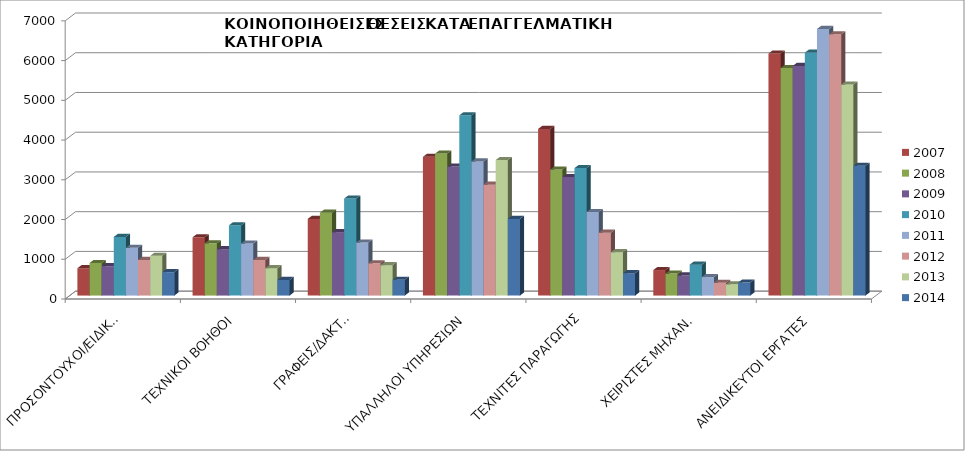
| Category | 2007 | 2008 | 2009 | 2010 | 2011 | 2012 | 2013 | 2014 |
|---|---|---|---|---|---|---|---|---|
| ΠΡΟΣΟΝΤΟΥΧΟΙ/ΕΙΔΙΚΟΙ | 688 | 819 | 741 | 1476 | 1201 | 896 | 999 | 590 |
| ΤΕΧΝΙΚΟΙ ΒΟΗΘΟΙ | 1467 | 1315 | 1167 | 1769 | 1310 | 895 | 690 | 393 |
| ΓΡΑΦΕΙΣ/ΔΑΚΤ.Ι | 1929 | 2084 | 1596 | 2442 | 1335 | 812 | 765 | 396 |
| ΥΠΑΛΛΗΛΟΙ ΥΠΗΡΕΣΙΩΝ | 3492 | 3573 | 3246 | 4536 | 3374 | 2791 | 3410 | 1930 |
| ΤΕΧΝΙΤΕΣ ΠΑΡΑΓΩΓΗΣ | 4193 | 3170 | 2981 | 3208 | 2101 | 1582 | 1092 | 563 |
| ΧΕΙΡΙΣΤΕΣ ΜΗΧΑΝ. | 642 | 553 | 505 | 778 | 466 | 321 | 284 | 328 |
| ΑΝΕΙΔΙΚΕΥΤΟΙ ΕΡΓΑΤΕΣ | 6090 | 5726 | 5780 | 6114 | 6709 | 6575 | 5311 | 3266 |